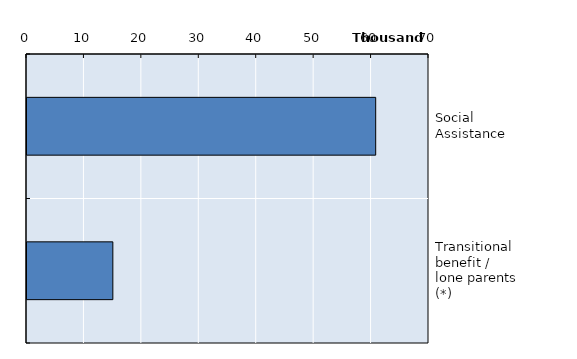
| Category | Series 0 |
|---|---|
| Social Assistance | 60717.8 |
| Transitional benefit / lone parents (*) | 14950 |